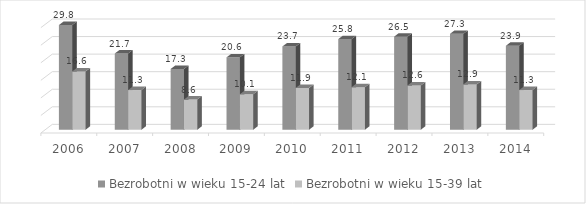
| Category | Bezrobotni w wieku 15-24 lat | Bezrobotni w wieku 15-39 lat |
|---|---|---|
| 2006.0 | 29.8 | 16.6 |
| 2007.0 | 21.7 | 11.3 |
| 2008.0 | 17.3 | 8.6 |
| 2009.0 | 20.6 | 10.1 |
| 2010.0 | 23.7 | 11.9 |
| 2011.0 | 25.8 | 12.1 |
| 2012.0 | 26.5 | 12.6 |
| 2013.0 | 27.3 | 12.9 |
| 2014.0 | 23.9 | 11.3 |